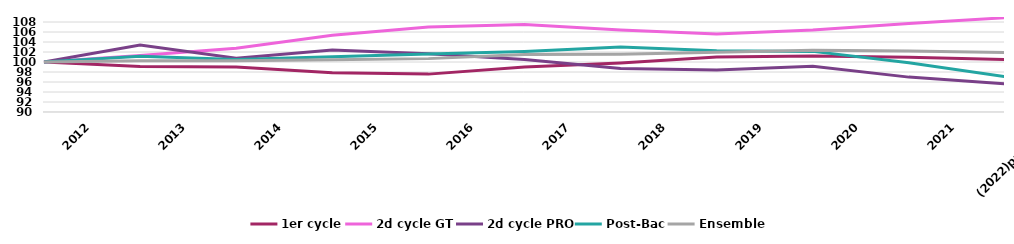
| Category | 1er cycle | 2d cycle GT | 2d cycle PRO | Post-Bac | Ensemble |
|---|---|---|---|---|---|
| 2012 | 100 | 100 | 100 | 100 | 100 |
| 2013 | 99.084 | 101.306 | 103.411 | 101.171 | 100.265 |
| 2014 | 98.981 | 102.739 | 100.752 | 100.519 | 100.23 |
| 2015 | 97.829 | 105.333 | 102.41 | 101.062 | 100.454 |
| 2016 | 97.576 | 107 | 101.636 | 101.618 | 100.675 |
| 2017 | 99.006 | 107.477 | 100.52 | 102.113 | 101.517 |
| 2018 | 99.812 | 106.391 | 98.712 | 102.994 | 101.539 |
| 2019 | 101.001 | 105.592 | 98.408 | 102.257 | 101.944 |
| 2020 | 101.207 | 106.389 | 99.165 | 102.125 | 102.347 |
| 2021 | 100.974 | 107.697 | 96.976 | 99.867 | 102.175 |
| (2022)prévisions | 100.495 | 108.855 | 95.638 | 97.091 | 101.895 |